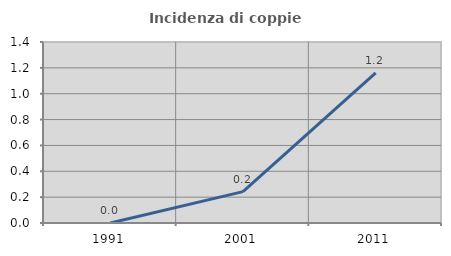
| Category | Incidenza di coppie miste |
|---|---|
| 1991.0 | 0 |
| 2001.0 | 0.243 |
| 2011.0 | 1.161 |